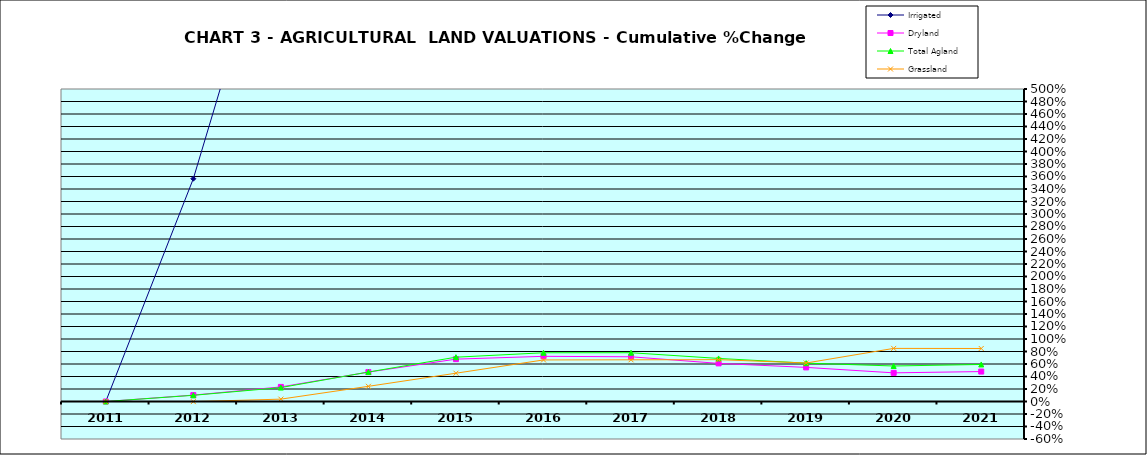
| Category | Irrigated | Dryland | Total Agland | Grassland |
|---|---|---|---|---|
| 2011.0 | 0 | 0 | 0 | 0 |
| 2012.0 | 3.565 | 0.102 | 0.099 | -0.002 |
| 2013.0 | 8.239 | 0.233 | 0.223 | 0.038 |
| 2014.0 | 13.143 | 0.47 | 0.471 | 0.243 |
| 2015.0 | 27.645 | 0.678 | 0.709 | 0.453 |
| 2016.0 | 31.145 | 0.723 | 0.78 | 0.665 |
| 2017.0 | 34.446 | 0.715 | 0.78 | 0.667 |
| 2018.0 | 35.397 | 0.61 | 0.689 | 0.67 |
| 2019.0 | 29.515 | 0.546 | 0.614 | 0.616 |
| 2020.0 | 32.154 | 0.458 | 0.568 | 0.85 |
| 2021.0 | 35.217 | 0.479 | 0.593 | 0.848 |